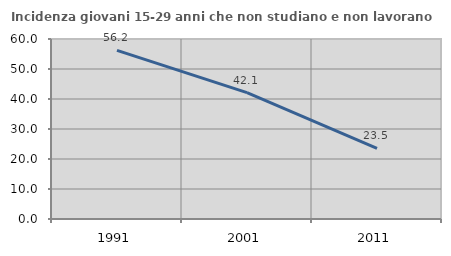
| Category | Incidenza giovani 15-29 anni che non studiano e non lavorano  |
|---|---|
| 1991.0 | 56.19 |
| 2001.0 | 42.105 |
| 2011.0 | 23.529 |